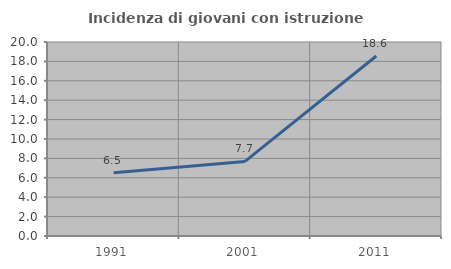
| Category | Incidenza di giovani con istruzione universitaria |
|---|---|
| 1991.0 | 6.522 |
| 2001.0 | 7.692 |
| 2011.0 | 18.557 |